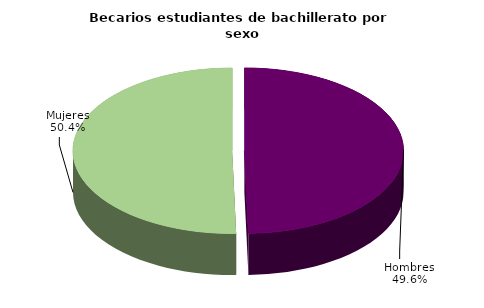
| Category | Series 0 |
|---|---|
| Hombres | 54236 |
| Mujeres | 55116 |